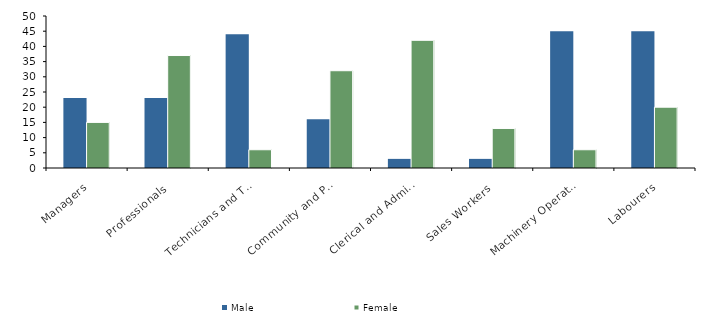
| Category | Male | Female |
|---|---|---|
| Managers | 23 | 15 |
| Professionals | 23 | 37 |
| Technicians and Trades Workers | 44 | 6 |
| Community and Personal Service Workers | 16 | 32 |
| Clerical and Administrative Workers | 3 | 42 |
| Sales Workers | 3 | 13 |
| Machinery Operators and Drivers | 45 | 6 |
| Labourers | 45 | 20 |